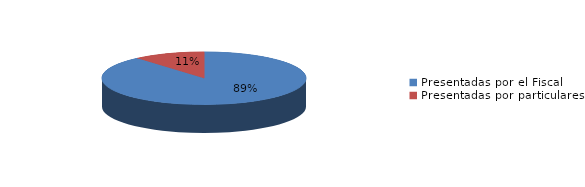
| Category | Series 0 |
|---|---|
| Presentadas por el Fiscal | 407 |
| Presentadas por particulares | 52 |